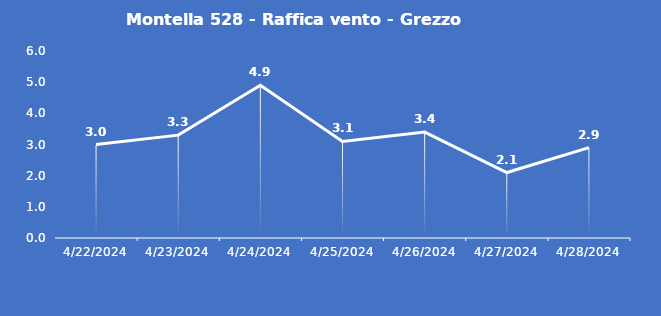
| Category | Montella 528 - Raffica vento - Grezzo (m/s) |
|---|---|
| 4/22/24 | 3 |
| 4/23/24 | 3.3 |
| 4/24/24 | 4.9 |
| 4/25/24 | 3.1 |
| 4/26/24 | 3.4 |
| 4/27/24 | 2.1 |
| 4/28/24 | 2.9 |